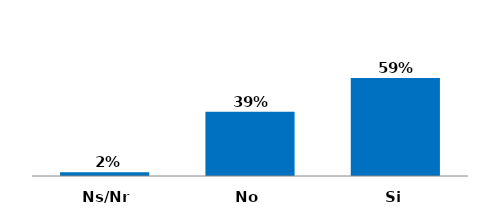
| Category | Series 0 |
|---|---|
| Si | 0.59 |
| No | 0.387 |
| Ns/Nr | 0.023 |